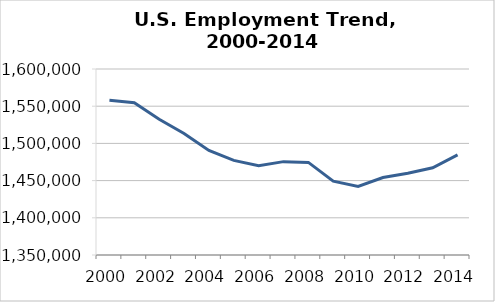
| Category | Series 0 |
|---|---|
| 2000.0 | 1557891 |
| 2001.0 | 1554605 |
| 2002.0 | 1532478 |
| 2003.0 | 1513437 |
| 2004.0 | 1490443 |
| 2005.0 | 1477142 |
| 2006.0 | 1470037 |
| 2007.0 | 1475489 |
| 2008.0 | 1474432 |
| 2009.0 | 1449172 |
| 2010.0 | 1442112 |
| 2011.0 | 1454090 |
| 2012.0 | 1459847 |
| 2013.0 | 1467238 |
| 2014.0 | 1484519 |